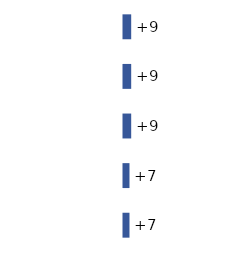
| Category | Series 0 |
|---|---|
| 0 | 9 |
| 1 | 9 |
| 2 | 9 |
| 3 | 7 |
| 4 | 7 |